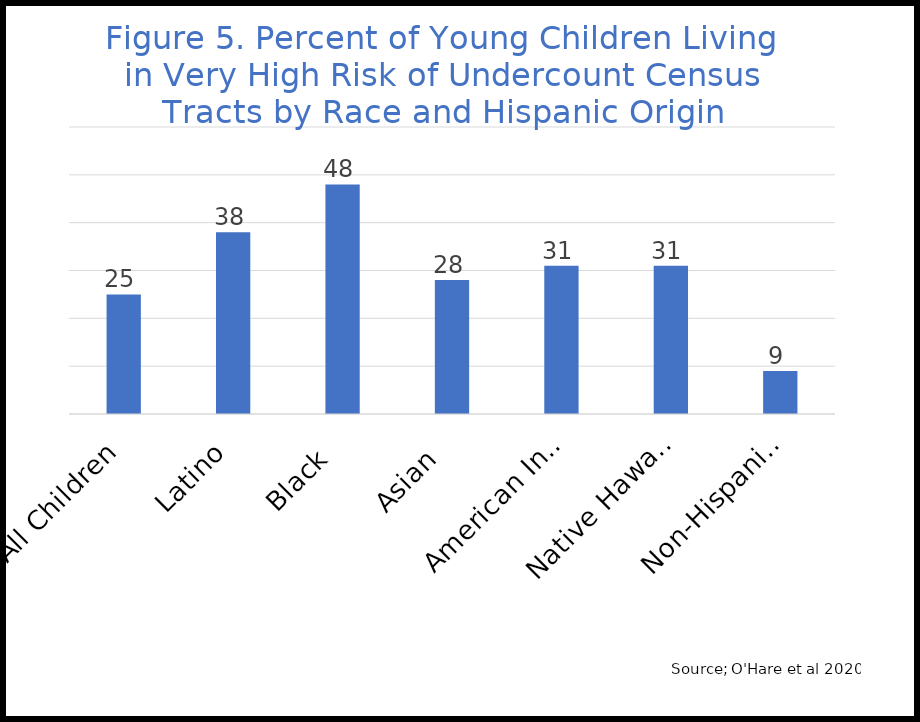
| Category | Percent in Very High Risk of Undercount Census Tracts |
|---|---|
| All Children | 25 |
| Latino | 38 |
| Black  | 48 |
| Asian  | 28 |
| American Indian/Alaskan Native | 31 |
| Native Hawaiian and Other PI | 31 |
| Non-Hispanic White  | 9 |